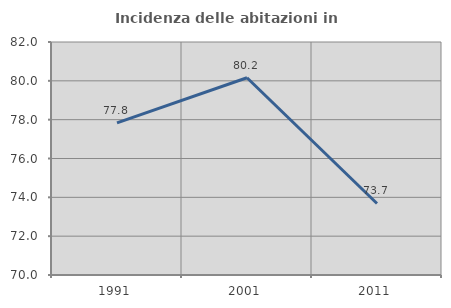
| Category | Incidenza delle abitazioni in proprietà  |
|---|---|
| 1991.0 | 77.838 |
| 2001.0 | 80.159 |
| 2011.0 | 73.684 |